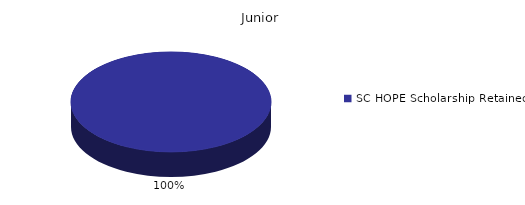
| Category | Junior |
|---|---|
| SC HOPE Scholarship Retained  | 1 |